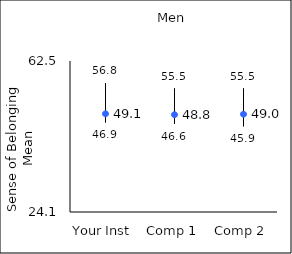
| Category | 25th percentile | 75th percentile | Mean |
|---|---|---|---|
| Your Inst | 46.9 | 56.8 | 49.08 |
| Comp 1 | 46.6 | 55.5 | 48.84 |
| Comp 2 | 45.9 | 55.5 | 48.97 |